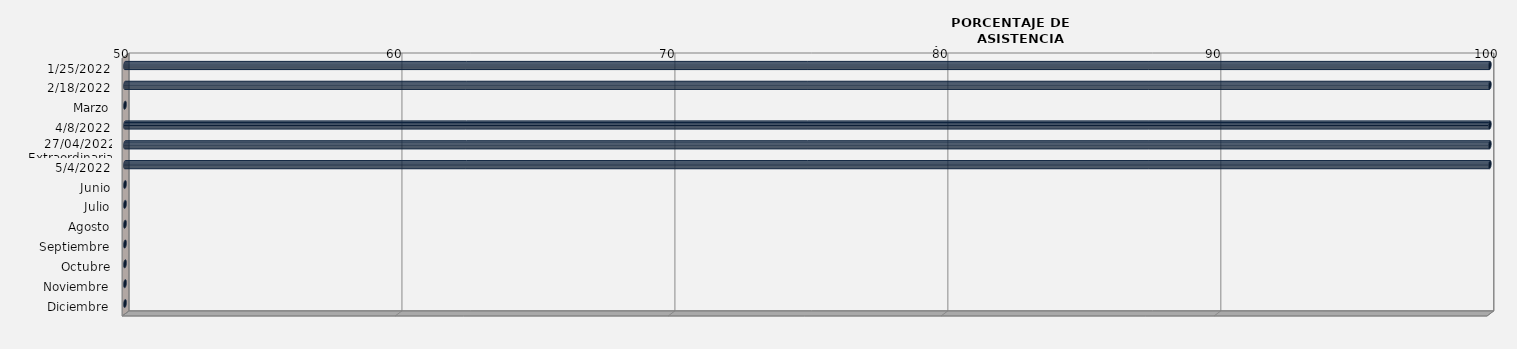
| Category | 25/01/2022 |
|---|---|
| 25/01/2022 | 100 |
| 18/02/2022 | 100 |
| Marzo | 0 |
| 08/04/2022 | 100 |
| 27/04/2022
Extraordinaria | 100 |
| 04/05/2022 | 100 |
| Junio | 0 |
| Julio | 0 |
| Agosto | 0 |
| Septiembre | 0 |
| Octubre | 0 |
| Noviembre | 0 |
| Diciembre | 0 |